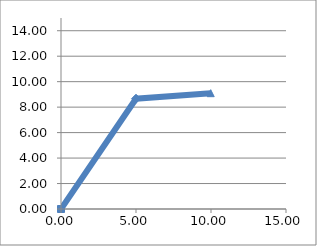
| Category | y |
|---|---|
| 0.0 | 0 |
| 5.000000000000001 | 8.66 |
| 9.980973490458728 | 9.096 |